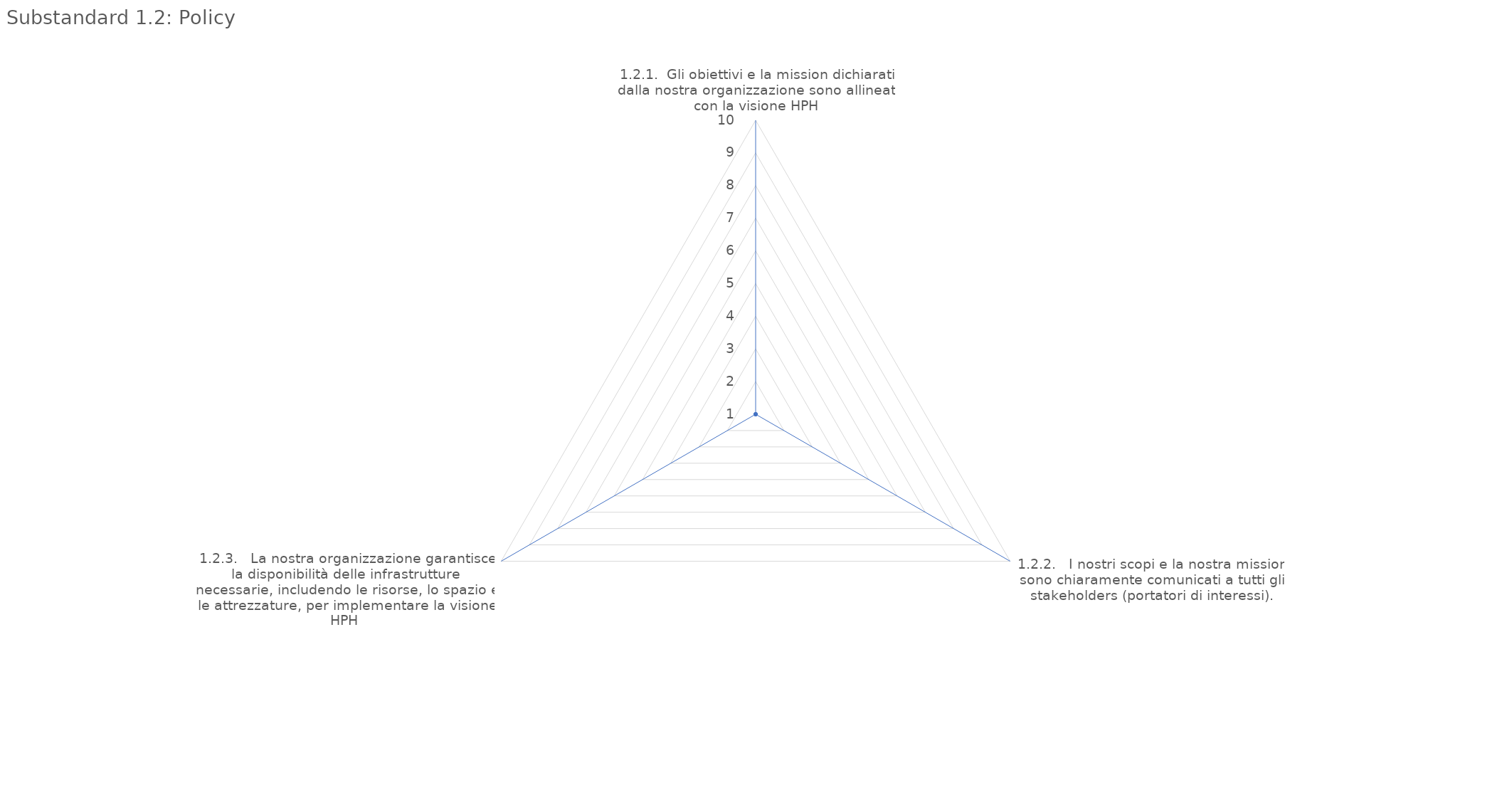
| Category | value |
|---|---|
| 1.2.1.  Gli obiettivi e la mission dichiarati dalla nostra organizzazione sono allineati con la visione HPH | 1 |
| 1.2.2.   I nostri scopi e la nostra mission sono chiaramente comunicati a tutti gli stakeholders (portatori di interessi). | 1 |
| 1.2.3.   La nostra organizzazione garantisce la disponibilità delle infrastrutture necessarie, includendo le risorse, lo spazio e le attrezzature, per implementare la visione HPH | 1 |